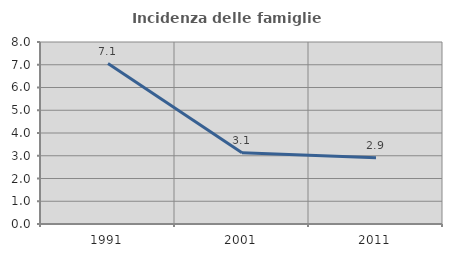
| Category | Incidenza delle famiglie numerose |
|---|---|
| 1991.0 | 7.054 |
| 2001.0 | 3.129 |
| 2011.0 | 2.912 |